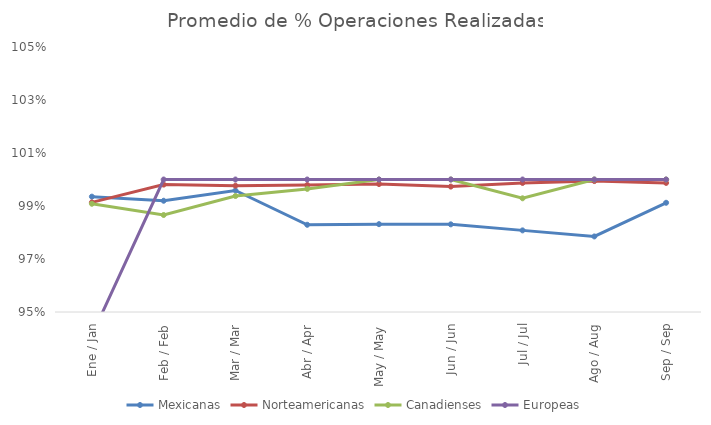
| Category | Mexicanas | Norteamericanas | Canadienses | Europeas |
|---|---|---|---|---|
| Ene / Jan | 0.994 | 0.991 | 0.991 | 0.941 |
| Feb / Feb | 0.992 | 0.998 | 0.987 | 1 |
| Mar / Mar | 0.996 | 0.998 | 0.994 | 1 |
| Abr / Apr | 0.983 | 0.998 | 0.996 | 1 |
| May / May | 0.983 | 0.998 | 1 | 1 |
| Jun / Jun | 0.983 | 0.997 | 1 | 1 |
| Jul / Jul | 0.981 | 0.999 | 0.993 | 1 |
| Ago / Aug | 0.979 | 0.999 | 1 | 1 |
| Sep / Sep | 0.991 | 0.999 | 1 | 1 |